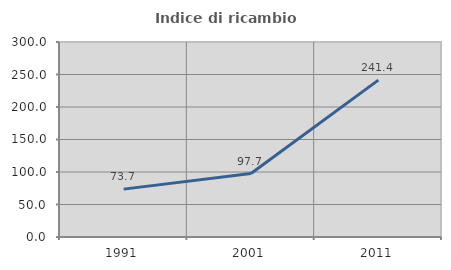
| Category | Indice di ricambio occupazionale  |
|---|---|
| 1991.0 | 73.665 |
| 2001.0 | 97.678 |
| 2011.0 | 241.379 |